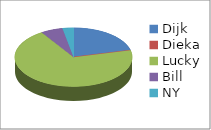
| Category | Series 0 | Series 1 |
|---|---|---|
| Dijk | 7 | 0.212 |
| Dieka | 0 | 0 |
| Lucky | 23 | 0.697 |
| Bill | 2 | 0.061 |
| NY | 1 | 0.03 |